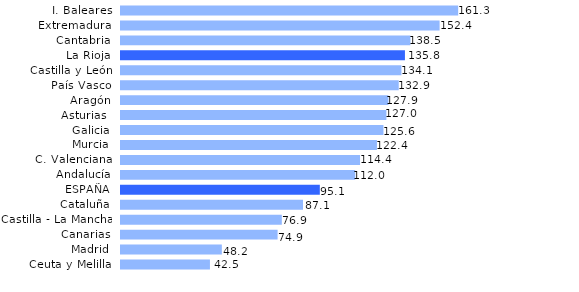
| Category | Series 0 |
|---|---|
| Ceuta y Melilla | 42.546 |
| Madrid | 48.232 |
| Canarias | 74.909 |
| Castilla - La Mancha | 76.919 |
| Cataluña | 87.059 |
| ESPAÑA | 95.112 |
| Andalucía | 112.045 |
| C. Valenciana | 114.355 |
| Murcia | 122.429 |
| Galicia | 125.551 |
| Asturias  | 126.954 |
| Aragón | 127.911 |
| País Vasco | 132.854 |
| Castilla y León | 134.148 |
| La Rioja | 135.826 |
| Cantabria | 138.451 |
| Extremadura | 152.408 |
| I. Baleares | 161.294 |